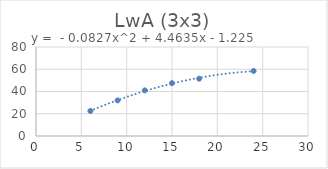
| Category | Series 0 |
|---|---|
| 6.0 | 22.5 |
| 9.0 | 32 |
| 12.0 | 41 |
| 15.0 | 47.5 |
| 18.0 | 51.5 |
| 24.0 | 58.5 |